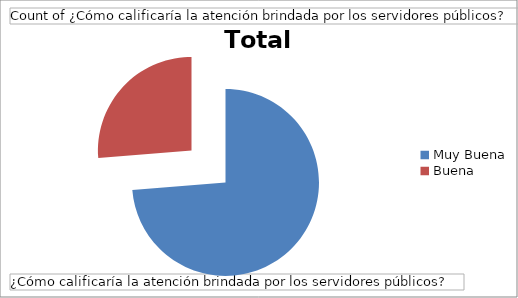
| Category | Total |
|---|---|
| Muy Buena | 157 |
| Buena | 56 |